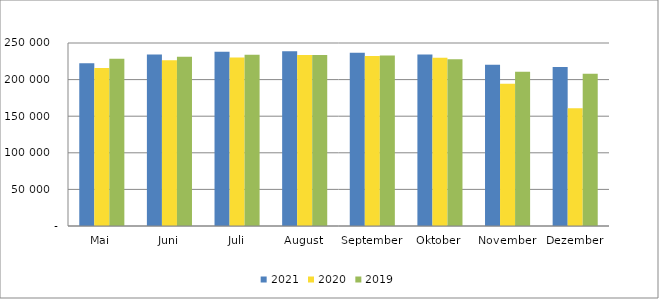
| Category | 2021 | 2020 | 2019 |
|---|---|---|---|
| Mai | 222364 | 215701 | 228514 |
| Juni | 234144 | 226300 | 231048 |
| Juli | 238061 | 230123 | 233904 |
| August | 238863 | 233456 | 233468 |
| September | 236822 | 232266 | 232871 |
| Oktober | 234389 | 229785 | 227830 |
| November | 220142 | 194308 | 210604 |
| Dezember | 217291 | 160807 | 208136 |